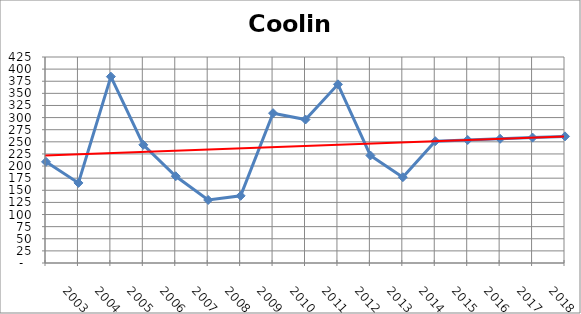
| Category | Cooling |
|---|---|
| 2003.0 | 208.7 |
| 2004.0 | 165.2 |
| 2005.0 | 384.5 |
| 2006.0 | 243.8 |
| 2007.0 | 179 |
| 2008.0 | 130 |
| 2009.0 | 138.6 |
| 2010.0 | 309.1 |
| 2011.0 | 296 |
| 2012.0 | 368.6 |
| 2013.0 | 221.8 |
| 2014.0 | 177 |
| 2015.0 | 251.312 |
| 2016.0 | 253.792 |
| 2017.0 | 256.272 |
| 2018.0 | 258.752 |
| 2019.0 | 261.232 |